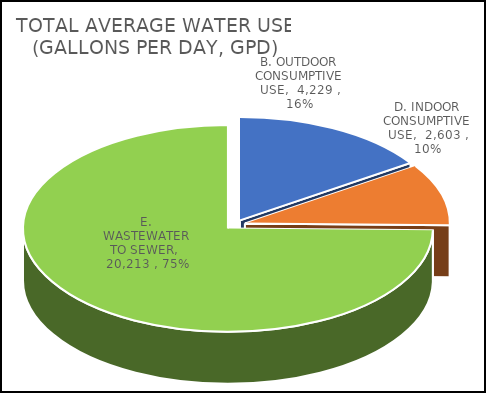
| Category | Series 0 |
|---|---|
| B. OUTDOOR CONSUMPTIVE USE | 4229.452 |
| D. INDOOR CONSUMPTIVE USE | 2603 |
| E. WASTEWATER TO SEWER | 20212.714 |